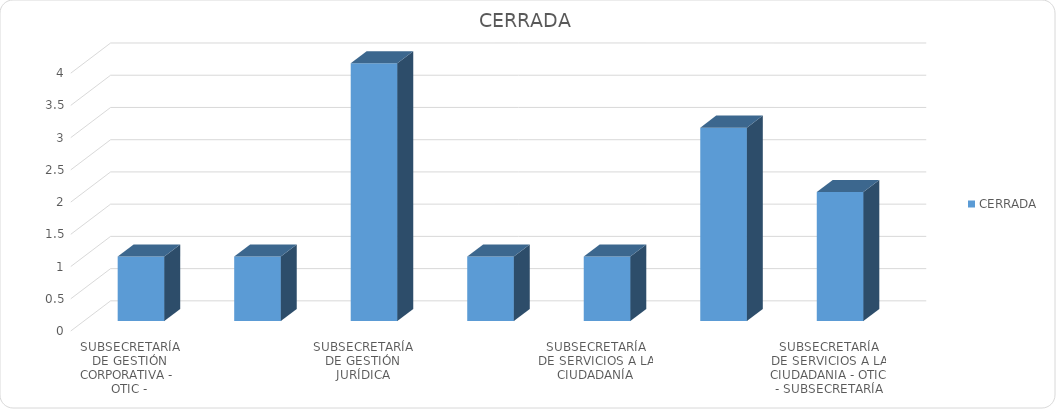
| Category | CERRADA |
|---|---|
| SUBSECRETARÍA DE GESTIÓN CORPORATIVA -  OTIC - SUBSECRETARÍA DE GESTIÓN JURÍDICA - SUBSECRETARÍA DE SERVICIOS A LA CIUDADANIA  | 1 |
| SUBSECRETARÍA DE GESTIÓN DE LA MOVILIDAD | 1 |
| SUBSECRETARÍA DE GESTIÓN JURÍDICA | 4 |
| SUBSECRETARÍA DE GESTIÓN JURÍDICA -  SUBSECRETARIA DE SERVICIOS A LA CIUDADANIA | 1 |
| SUBSECRETARÍA DE SERVICIOS A LA CIUDADANÍA | 1 |
| SUBSECRETARÍA DE SERVICIOS A LA CIUDADANIA - OTIC - SUBSECRETARÍA DE GESTIÓN CORPORATIVA | 3 |
| SUBSECRETARÍA DE SERVICIOS A LA CIUDADANIA - OTIC - SUBSECRETARÍA DE GESTIÓN CORPORATIVA - SUBSECRETARÍA DE GESTIÓN JURÍDICA | 2 |